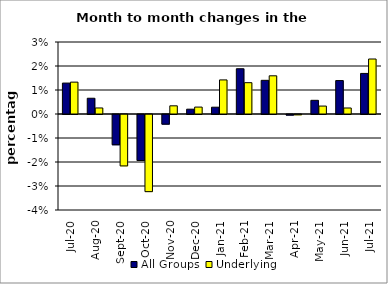
| Category | All Groups | Underlying |
|---|---|---|
| 2020-07-01 | 0.013 | 0.013 |
| 2020-08-01 | 0.007 | 0.003 |
| 2020-09-01 | -0.013 | -0.021 |
| 2020-10-01 | -0.019 | -0.032 |
| 2020-11-01 | -0.004 | 0.003 |
| 2020-12-01 | 0.002 | 0.003 |
| 2021-01-01 | 0.003 | 0.014 |
| 2021-02-01 | 0.019 | 0.013 |
| 2021-03-01 | 0.014 | 0.016 |
| 2021-04-01 | 0 | 0 |
| 2021-05-01 | 0.006 | 0.003 |
| 2021-06-01 | 0.014 | 0.003 |
| 2021-07-01 | 0.017 | 0.023 |